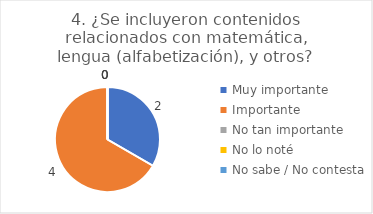
| Category | 4. ¿Se incluyeron contenidos relacionados con matemática, lengua (alfabetización), y otros? |
|---|---|
| Muy importante  | 0.333 |
| Importante  | 0.667 |
| No tan importante  | 0 |
| No lo noté  | 0 |
| No sabe / No contesta | 0 |